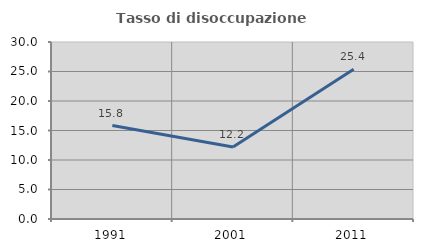
| Category | Tasso di disoccupazione giovanile  |
|---|---|
| 1991.0 | 15.839 |
| 2001.0 | 12.189 |
| 2011.0 | 25.373 |